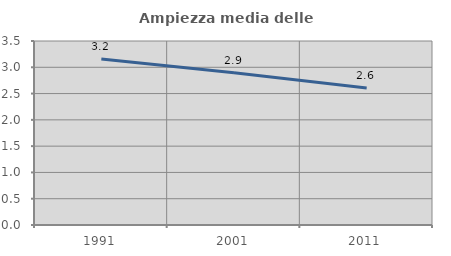
| Category | Ampiezza media delle famiglie |
|---|---|
| 1991.0 | 3.16 |
| 2001.0 | 2.897 |
| 2011.0 | 2.605 |